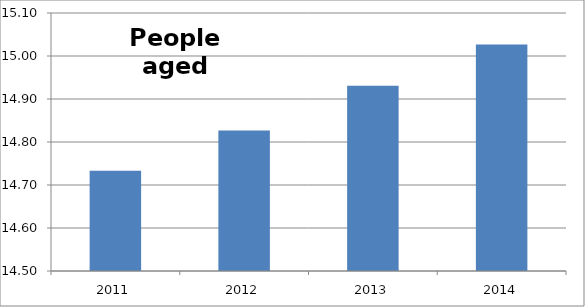
| Category | Series 0 |
|---|---|
| 2011 | 14.733 |
| 2012 | 14.827 |
| 2013 | 14.931 |
| 2014 | 15.027 |